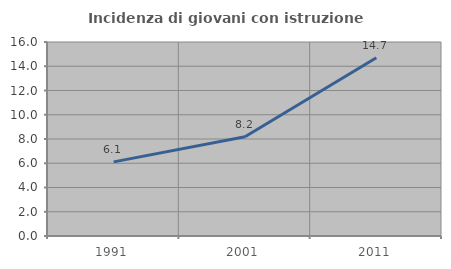
| Category | Incidenza di giovani con istruzione universitaria |
|---|---|
| 1991.0 | 6.112 |
| 2001.0 | 8.179 |
| 2011.0 | 14.706 |